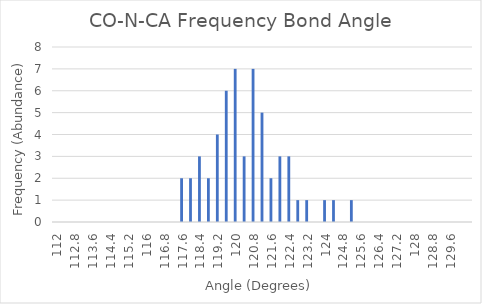
| Category | Series 0 |
|---|---|
| 112.0 | 0 |
| 112.4 | 0 |
| 112.80000000000001 | 0 |
| 113.20000000000002 | 0 |
| 113.60000000000002 | 0 |
| 114.00000000000003 | 0 |
| 114.40000000000003 | 0 |
| 114.80000000000004 | 0 |
| 115.20000000000005 | 0 |
| 115.60000000000005 | 0 |
| 116.00000000000006 | 0 |
| 116.40000000000006 | 0 |
| 116.80000000000007 | 0 |
| 117.20000000000007 | 0 |
| 117.60000000000008 | 2 |
| 118.00000000000009 | 2 |
| 118.40000000000009 | 3 |
| 118.8000000000001 | 2 |
| 119.2000000000001 | 4 |
| 119.60000000000011 | 6 |
| 120.00000000000011 | 7 |
| 120.40000000000012 | 3 |
| 120.80000000000013 | 7 |
| 121.20000000000013 | 5 |
| 121.60000000000014 | 2 |
| 122.00000000000014 | 3 |
| 122.40000000000015 | 3 |
| 122.80000000000015 | 1 |
| 123.20000000000016 | 1 |
| 123.60000000000016 | 0 |
| 124.00000000000017 | 1 |
| 124.40000000000018 | 1 |
| 124.80000000000018 | 0 |
| 125.20000000000019 | 1 |
| 125.6000000000002 | 0 |
| 126.0000000000002 | 0 |
| 126.4000000000002 | 0 |
| 126.80000000000021 | 0 |
| 127.20000000000022 | 0 |
| 127.60000000000022 | 0 |
| 128.00000000000023 | 0 |
| 128.40000000000023 | 0 |
| 128.80000000000024 | 0 |
| 129.20000000000024 | 0 |
| 129.60000000000025 | 0 |
| 130.00000000000026 | 0 |